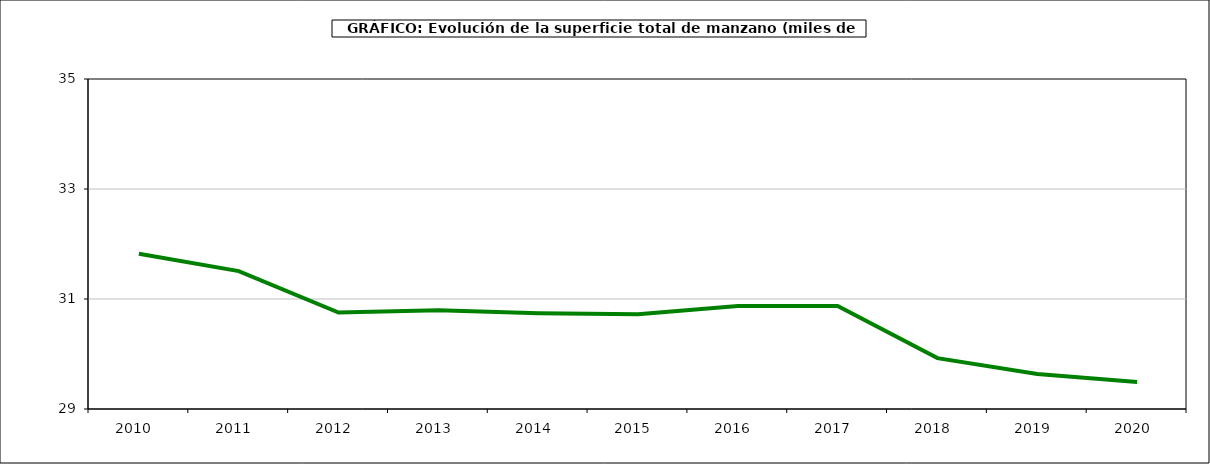
| Category | superficie manzano |
|---|---|
| 2010.0 | 31.822 |
| 2011.0 | 31.507 |
| 2012.0 | 30.753 |
| 2013.0 | 30.794 |
| 2014.0 | 30.739 |
| 2015.0 | 30.721 |
| 2016.0 | 30.872 |
| 2017.0 | 30.872 |
| 2018.0 | 29.925 |
| 2019.0 | 29.637 |
| 2020.0 | 29.49 |